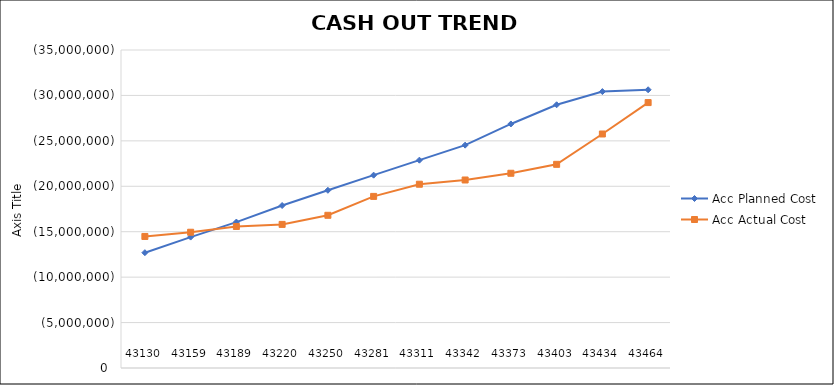
| Category | Acc Planned Cost | Acc Actual Cost |
|---|---|---|
| 2018-01-30 | -12691897.71 | -14476821.664 |
| 2018-02-28 | -14409497.545 | -14941579.814 |
| 2018-03-30 | -16060752.706 | -15577646.178 |
| 2018-04-30 | -17884402.2 | -15805628.378 |
| 2018-05-30 | -19559618.777 | -16808172.078 |
| 2018-06-30 | -21226167.947 | -18887824.078 |
| 2018-07-30 | -22875236.288 | -20225957.188 |
| 2018-08-30 | -24529304.629 | -20692426.118 |
| 2018-09-30 | -26859358.884 | -21433655.918 |
| 2018-10-30 | -28971004.719 | -22415849.908 |
| 2018-11-30 | -30420919.446 | -25754933.468 |
| 2018-12-30 | -30623082.645 | -29211739.128 |